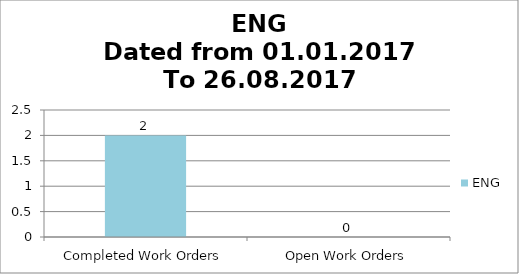
| Category | ENG |
|---|---|
| Completed Work Orders | 2 |
| Open Work Orders | 0 |